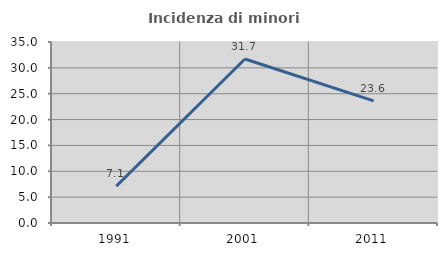
| Category | Incidenza di minori stranieri |
|---|---|
| 1991.0 | 7.143 |
| 2001.0 | 31.707 |
| 2011.0 | 23.611 |